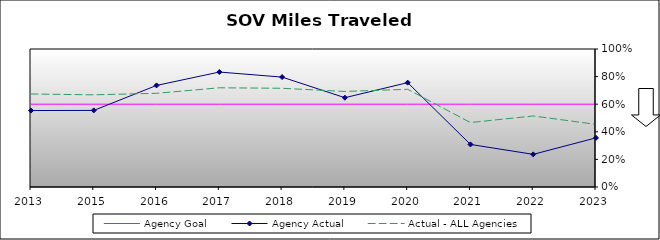
| Category | Agency Goal | Agency Actual | Actual - ALL Agencies |
|---|---|---|---|
| 2013.0 | 0.6 | 0.554 | 0.674 |
| 2015.0 | 0.6 | 0.555 | 0.668 |
| 2016.0 | 0.6 | 0.736 | 0.679 |
| 2017.0 | 0.6 | 0.833 | 0.719 |
| 2018.0 | 0.6 | 0.796 | 0.715 |
| 2019.0 | 0.6 | 0.647 | 0.692 |
| 2020.0 | 0.6 | 0.756 | 0.708 |
| 2021.0 | 0.6 | 0.308 | 0.467 |
| 2022.0 | 0.6 | 0.237 | 0.515 |
| 2023.0 | 0.6 | 0.356 | 0.454 |